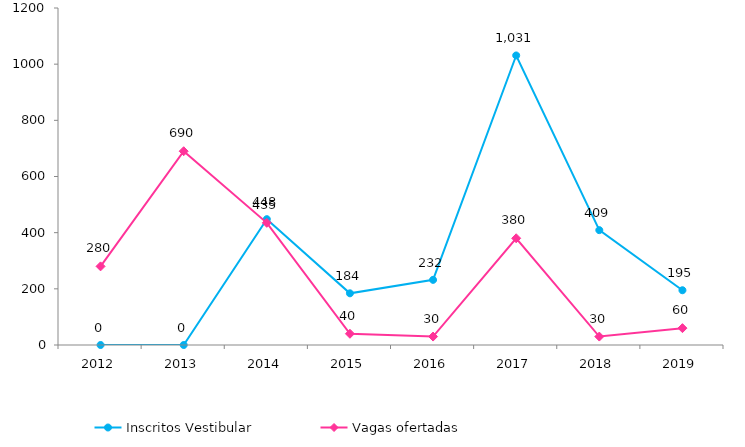
| Category | Inscritos Vestibular |
|---|---|
| 2012.0 | 0 |
| 2013.0 | 0 |
| 2014.0 | 448 |
| 2015.0 | 184 |
| 2016.0 | 232 |
| 2017.0 | 1031 |
| 2018.0 | 409 |
| 2019.0 | 195 |